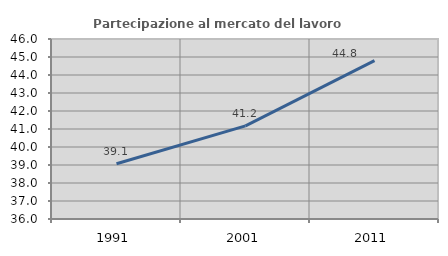
| Category | Partecipazione al mercato del lavoro  femminile |
|---|---|
| 1991.0 | 39.068 |
| 2001.0 | 41.176 |
| 2011.0 | 44.794 |